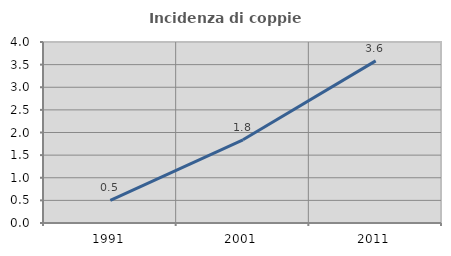
| Category | Incidenza di coppie miste |
|---|---|
| 1991.0 | 0.5 |
| 2001.0 | 1.839 |
| 2011.0 | 3.583 |